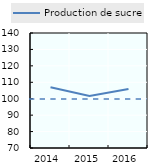
| Category | Production de sucre |
|---|---|
| 2014.0 | 106.958 |
| 2015.0 | 101.598 |
| 2016.0 | 105.921 |